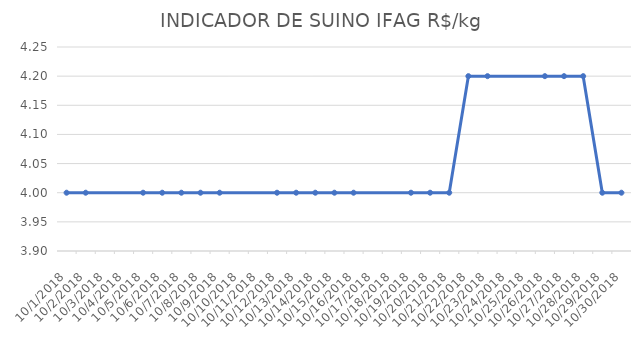
| Category | INDICADOR DE SUINO IFAG |
|---|---|
| 10/1/18 | 4 |
| 10/2/18 | 4 |
| 10/5/18 | 4 |
| 10/6/18 | 4 |
| 10/7/18 | 4 |
| 10/8/18 | 4 |
| 10/9/18 | 4 |
| 10/12/18 | 4 |
| 10/13/18 | 4 |
| 10/14/18 | 4 |
| 10/15/18 | 4 |
| 10/16/18 | 4 |
| 10/19/18 | 4 |
| 10/20/18 | 4 |
| 10/21/18 | 4 |
| 10/22/18 | 4.2 |
| 10/23/18 | 4.2 |
| 10/26/18 | 4.2 |
| 10/27/18 | 4.2 |
| 10/28/18 | 4.2 |
| 10/29/18 | 4 |
| 10/30/18 | 4 |